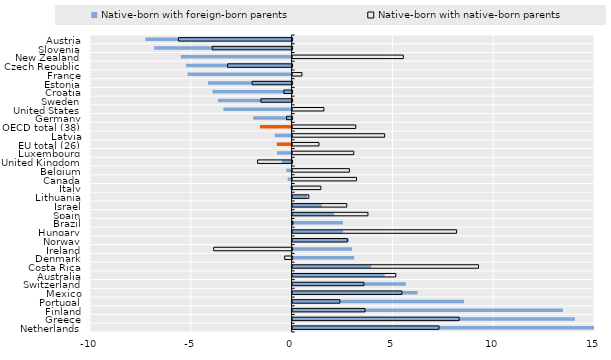
| Category | Native-born with foreign-born parents | Native-born with native-born parents |
|---|---|---|
| Austria | -7.253 | -5.639 |
| Slovenia | -6.817 | -3.965 |
| New Zealand | -5.497 | 5.493 |
| Czech Republic | -5.244 | -3.2 |
| France | -5.159 | 0.462 |
| Estonia | -4.153 | -1.982 |
| Croatia | -3.925 | -0.41 |
| Sweden | -3.65 | -1.55 |
| United States | -3.382 | 1.553 |
| Germany | -1.907 | -0.276 |
| OECD total (38) | -1.564 | 3.134 |
| Latvia | -0.835 | 4.567 |
| EU total (26) | -0.729 | 1.309 |
| Luxembourg | -0.724 | 3.033 |
| United Kingdom | -0.48 | -1.712 |
| Belgium | -0.26 | 2.818 |
| Canada | -0.2 | 3.172 |
| Italy | -0.073 | 1.402 |
| Lithuania | 0.715 | 0.802 |
| Israel | 1.446 | 2.687 |
| Spain | 2.061 | 3.738 |
| Brazil | 2.493 | 0.019 |
| Hungary | 2.497 | 8.135 |
| Norway | 2.798 | 2.714 |
| Ireland | 2.947 | -3.89 |
| Denmark | 3.053 | -0.369 |
| Costa Rica | 3.897 | 9.221 |
| Australia | 4.566 | 5.12 |
| Switzerland | 5.617 | 3.537 |
| Mexico | 6.202 | 5.425 |
| Portugal | 8.507 | 2.345 |
| Finland | 13.412 | 3.592 |
| Greece | 14.007 | 8.262 |
| Netherlands | 18.928 | 7.264 |